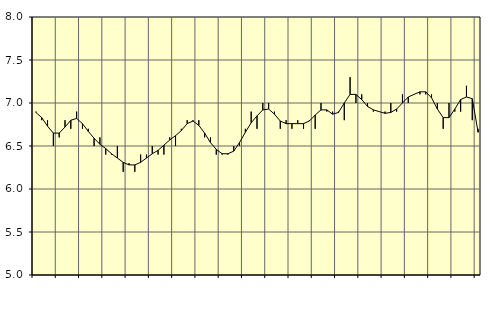
| Category | Piggar | Transport, SNI 49-53 |
|---|---|---|
| nan | 6.9 | 6.89 |
| 1.0 | 6.8 | 6.83 |
| 1.0 | 6.8 | 6.73 |
| 1.0 | 6.5 | 6.65 |
| nan | 6.6 | 6.65 |
| 2.0 | 6.8 | 6.72 |
| 2.0 | 6.7 | 6.8 |
| 2.0 | 6.9 | 6.82 |
| nan | 6.7 | 6.76 |
| 3.0 | 6.7 | 6.67 |
| 3.0 | 6.5 | 6.59 |
| 3.0 | 6.6 | 6.52 |
| nan | 6.4 | 6.47 |
| 4.0 | 6.4 | 6.41 |
| 4.0 | 6.5 | 6.36 |
| 4.0 | 6.2 | 6.31 |
| nan | 6.3 | 6.28 |
| 5.0 | 6.2 | 6.28 |
| 5.0 | 6.4 | 6.31 |
| 5.0 | 6.4 | 6.36 |
| nan | 6.5 | 6.41 |
| 6.0 | 6.4 | 6.45 |
| 6.0 | 6.4 | 6.51 |
| 6.0 | 6.6 | 6.57 |
| nan | 6.5 | 6.62 |
| 7.0 | 6.7 | 6.68 |
| 7.0 | 6.8 | 6.76 |
| 7.0 | 6.8 | 6.79 |
| nan | 6.8 | 6.74 |
| 8.0 | 6.6 | 6.65 |
| 8.0 | 6.6 | 6.54 |
| 8.0 | 6.4 | 6.46 |
| nan | 6.4 | 6.41 |
| 9.0 | 6.4 | 6.41 |
| 9.0 | 6.5 | 6.44 |
| 9.0 | 6.5 | 6.54 |
| nan | 6.7 | 6.66 |
| 10.0 | 6.9 | 6.77 |
| 10.0 | 6.7 | 6.85 |
| 10.0 | 7 | 6.92 |
| nan | 7 | 6.93 |
| 11.0 | 6.9 | 6.87 |
| 11.0 | 6.7 | 6.79 |
| 11.0 | 6.8 | 6.76 |
| nan | 6.7 | 6.76 |
| 12.0 | 6.8 | 6.76 |
| 12.0 | 6.7 | 6.76 |
| 12.0 | 6.8 | 6.79 |
| nan | 6.7 | 6.86 |
| 13.0 | 7 | 6.92 |
| 13.0 | 6.9 | 6.92 |
| 13.0 | 6.9 | 6.87 |
| nan | 6.9 | 6.89 |
| 14.0 | 6.8 | 7 |
| 14.0 | 7.3 | 7.1 |
| 14.0 | 7 | 7.1 |
| nan | 7.1 | 7.04 |
| 15.0 | 7 | 6.96 |
| 15.0 | 6.9 | 6.92 |
| 15.0 | 6.9 | 6.9 |
| nan | 6.9 | 6.88 |
| 16.0 | 7 | 6.89 |
| 16.0 | 6.9 | 6.93 |
| 16.0 | 7.1 | 7 |
| nan | 7 | 7.07 |
| 17.0 | 7.1 | 7.1 |
| 17.0 | 7.1 | 7.13 |
| 17.0 | 7.1 | 7.13 |
| nan | 7.1 | 7.06 |
| 18.0 | 7 | 6.93 |
| 18.0 | 6.7 | 6.83 |
| 18.0 | 7 | 6.83 |
| nan | 6.9 | 6.93 |
| 19.0 | 6.9 | 7.04 |
| 19.0 | 7.2 | 7.07 |
| 19.0 | 6.8 | 7.05 |
| nan | 6.7 | 6.66 |